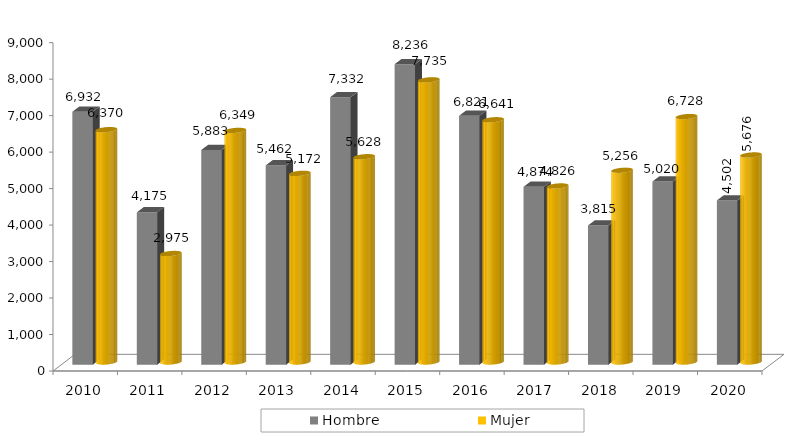
| Category | Hombre | Mujer |
|---|---|---|
| 2010.0 | 6932 | 6370 |
| 2011.0 | 4175 | 2975 |
| 2012.0 | 5883 | 6349 |
| 2013.0 | 5462 | 5172 |
| 2014.0 | 7332 | 5628 |
| 2015.0 | 8236 | 7735 |
| 2016.0 | 6821 | 6641 |
| 2017.0 | 4874 | 4826 |
| 2018.0 | 3815 | 5256 |
| 2019.0 | 5020 | 6728 |
| 2020.0 | 4502 | 5676 |